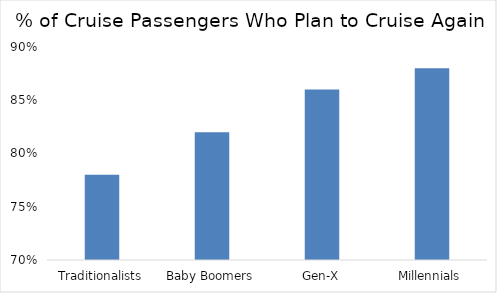
| Category | Series 0 |
|---|---|
| Traditionalists | 0.78 |
| Baby Boomers | 0.82 |
| Gen-X | 0.86 |
| Millennials | 0.88 |